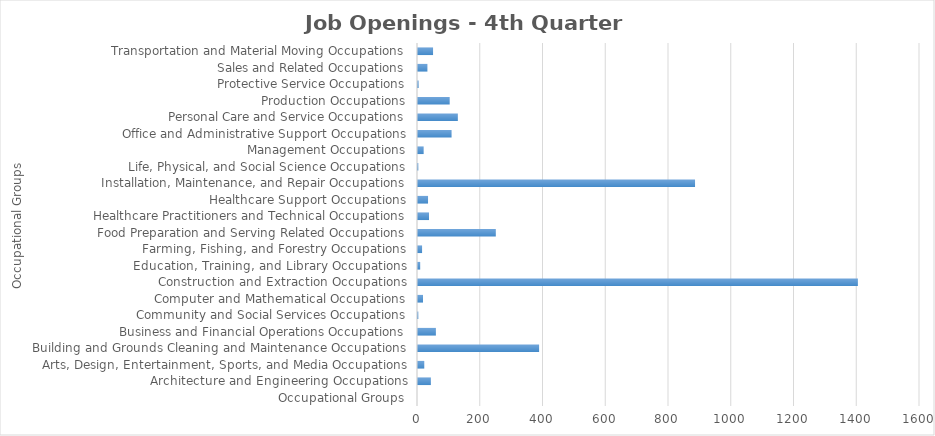
| Category | Series1 |
|---|---|
| Occupational Groups | 0 |
| Architecture and Engineering Occupations | 41 |
| Arts, Design, Entertainment, Sports, and Media Occupations | 20 |
| Building and Grounds Cleaning and Maintenance Occupations | 386 |
| Business and Financial Operations Occupations | 57 |
| Community and Social Services Occupations | 1 |
| Computer and Mathematical Occupations | 16 |
| Construction and Extraction Occupations | 1402 |
| Education, Training, and Library Occupations | 7 |
| Farming, Fishing, and Forestry Occupations | 13 |
| Food Preparation and Serving Related Occupations | 248 |
| Healthcare Practitioners and Technical Occupations | 35 |
| Healthcare Support Occupations | 32 |
| Installation, Maintenance, and Repair Occupations | 883 |
| Life, Physical, and Social Science Occupations | 1 |
| Management Occupations | 18 |
| Office and Administrative Support Occupations | 107 |
| Personal Care and Service Occupations | 127 |
| Production Occupations | 101 |
| Protective Service Occupations | 2 |
| Sales and Related Occupations | 30 |
| Transportation and Material Moving Occupations | 48 |